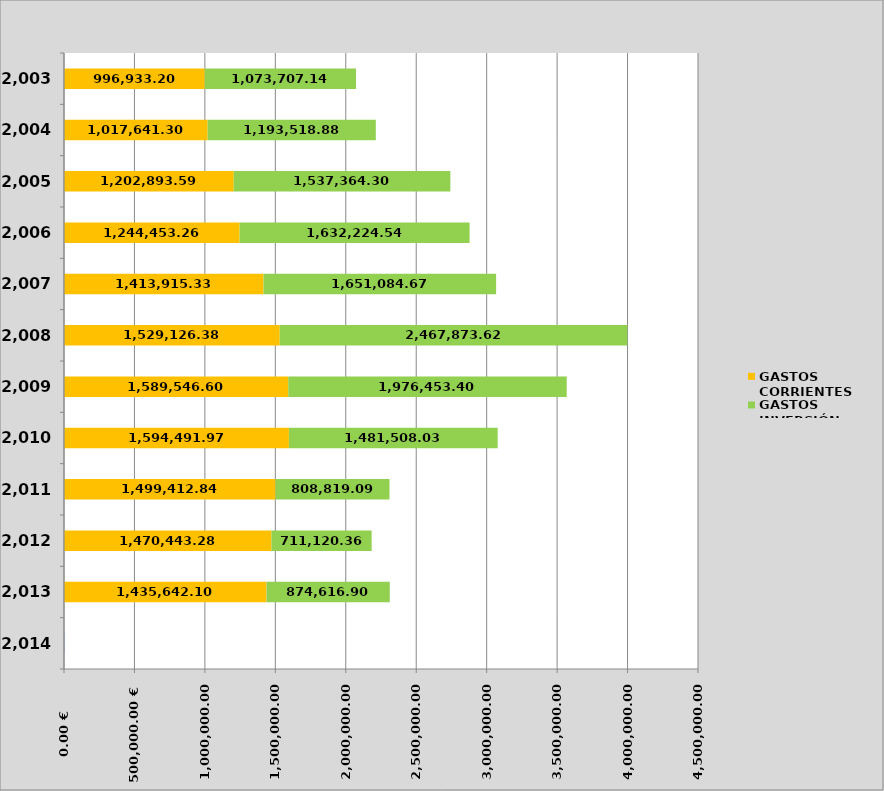
| Category | AÑO | GASTOS CORRIENTES | GASTOS INVERSIÓN |
|---|---|---|---|
| 2014.0 | 2014 | 0 | 0 |
| 2013.0 | 2013 | 1435642.1 | 874616.904 |
| 2012.0 | 2012 | 1470443.275 | 711120.36 |
| 2011.0 | 2011 | 1499412.835 | 808819.09 |
| 2010.0 | 2010 | 1594491.966 | 1481508.03 |
| 2009.0 | 2009 | 1589546.6 | 1976453.4 |
| 2008.0 | 2008 | 1529126.38 | 2467873.62 |
| 2007.0 | 2007 | 1413915.33 | 1651084.67 |
| 2006.0 | 2006 | 1244453.26 | 1632224.54 |
| 2005.0 | 2005 | 1202893.59 | 1537364.3 |
| 2004.0 | 2004 | 1017641.3 | 1193518.88 |
| 2003.0 | 2003 | 996933.2 | 1073707.14 |